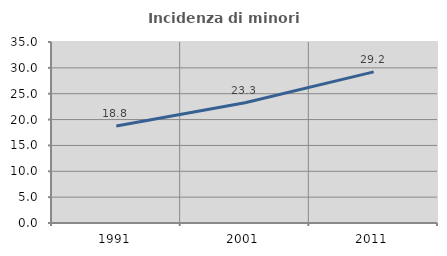
| Category | Incidenza di minori stranieri |
|---|---|
| 1991.0 | 18.75 |
| 2001.0 | 23.265 |
| 2011.0 | 29.227 |